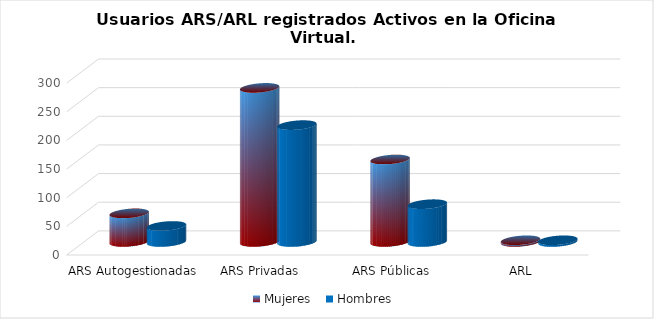
| Category | Mujeres | Hombres |
|---|---|---|
| ARS Autogestionadas | 50 | 28 |
| ARS Privadas | 269 | 204 |
| ARS Públicas | 144 | 66 |
| ARL | 3 | 3 |